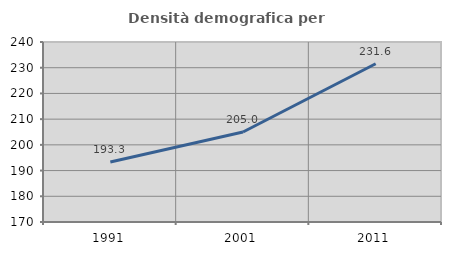
| Category | Densità demografica |
|---|---|
| 1991.0 | 193.349 |
| 2001.0 | 205 |
| 2011.0 | 231.554 |